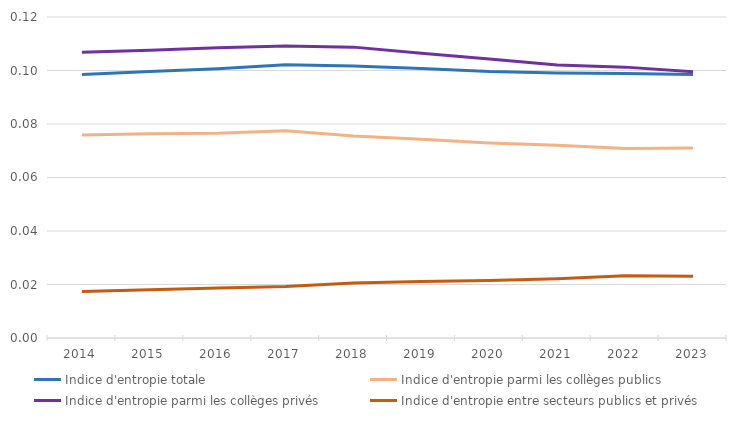
| Category | Indice d'entropie totale | Indice d'entropie parmi les collèges publics | Indice d'entropie parmi les collèges privés | Indice d'entropie entre secteurs publics et privés |
|---|---|---|---|---|
| 2014.0 | 0.098 | 0.076 | 0.107 | 0.017 |
| 2015.0 | 0.1 | 0.076 | 0.108 | 0.018 |
| 2016.0 | 0.101 | 0.077 | 0.109 | 0.019 |
| 2017.0 | 0.102 | 0.078 | 0.109 | 0.019 |
| 2018.0 | 0.102 | 0.076 | 0.109 | 0.021 |
| 2019.0 | 0.101 | 0.074 | 0.106 | 0.021 |
| 2020.0 | 0.1 | 0.073 | 0.104 | 0.022 |
| 2021.0 | 0.099 | 0.072 | 0.102 | 0.022 |
| 2022.0 | 0.099 | 0.071 | 0.101 | 0.023 |
| 2023.0 | 0.099 | 0.071 | 0.1 | 0.023 |